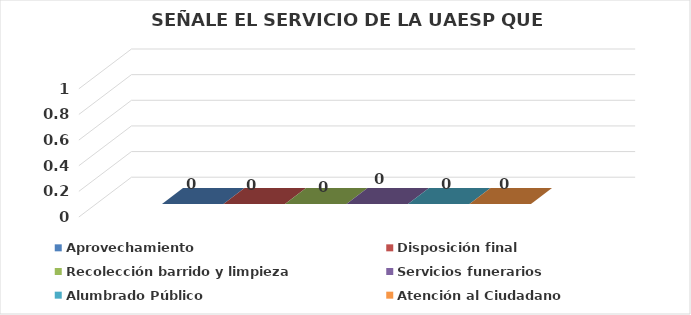
| Category | Aprovechamiento | Disposición final | Recolección barrido y limpieza | Servicios funerarios | Alumbrado Público | Atención al Ciudadano |
|---|---|---|---|---|---|---|
| 0 | 0 | 0 | 0 | 0 | 0 | 0 |